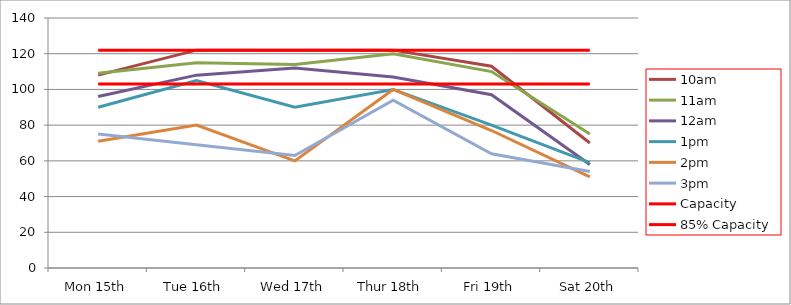
| Category | 9am | 10am | 11am | 12am | 1pm | 2pm | 3pm | 4pm | 5pm | Capacity | 85% Capacity |
|---|---|---|---|---|---|---|---|---|---|---|---|
| Mon 15th |  | 108 | 109 | 96 | 90 | 71 | 75 |  |  | 122 | 103 |
| Tue 16th |  | 122 | 115 | 108 | 105 | 80 | 69 |  |  | 122 | 103 |
| Wed 17th |  | 122 | 114 | 112 | 90 | 60 | 63 |  |  | 122 | 103 |
| Thur 18th |  | 122 | 120 | 107 | 100 | 100 | 94 |  |  | 122 | 103 |
| Fri 19th |  | 113 | 110 | 97 | 80 | 77 | 64 |  |  | 122 | 103 |
| Sat 20th |  | 70 | 75 | 58 | 59 | 51 | 54 |  |  | 122 | 103 |